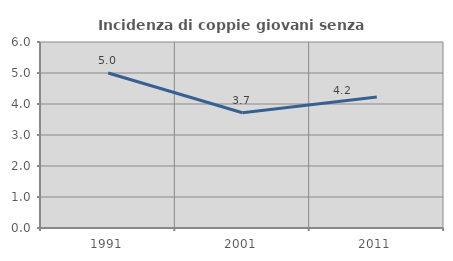
| Category | Incidenza di coppie giovani senza figli |
|---|---|
| 1991.0 | 5 |
| 2001.0 | 3.717 |
| 2011.0 | 4.223 |